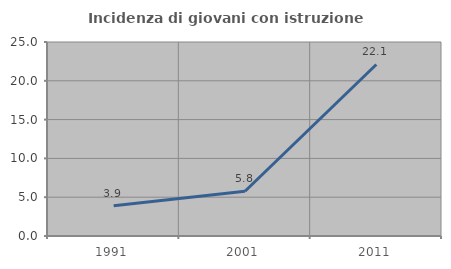
| Category | Incidenza di giovani con istruzione universitaria |
|---|---|
| 1991.0 | 3.883 |
| 2001.0 | 5.769 |
| 2011.0 | 22.105 |